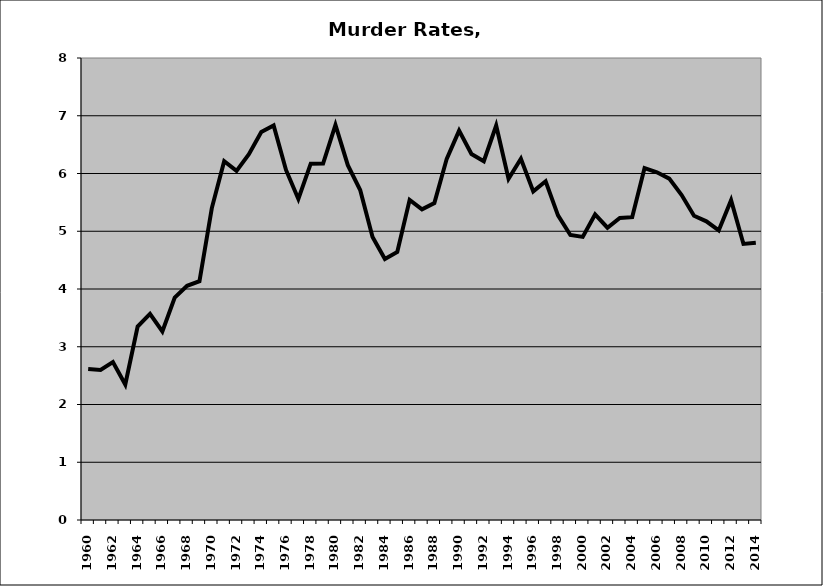
| Category | Murder |
|---|---|
| 1960.0 | 2.615 |
| 1961.0 | 2.599 |
| 1962.0 | 2.734 |
| 1963.0 | 2.346 |
| 1964.0 | 3.351 |
| 1965.0 | 3.568 |
| 1966.0 | 3.264 |
| 1967.0 | 3.852 |
| 1968.0 | 4.056 |
| 1969.0 | 4.135 |
| 1970.0 | 5.401 |
| 1971.0 | 6.213 |
| 1972.0 | 6.046 |
| 1973.0 | 6.335 |
| 1974.0 | 6.717 |
| 1975.0 | 6.832 |
| 1976.0 | 6.061 |
| 1977.0 | 5.558 |
| 1978.0 | 6.17 |
| 1979.0 | 6.172 |
| 1980.0 | 6.842 |
| 1981.0 | 6.145 |
| 1982.0 | 5.714 |
| 1983.0 | 4.901 |
| 1984.0 | 4.521 |
| 1985.0 | 4.64 |
| 1986.0 | 5.543 |
| 1987.0 | 5.379 |
| 1988.0 | 5.488 |
| 1989.0 | 6.254 |
| 1990.0 | 6.741 |
| 1991.0 | 6.337 |
| 1992.0 | 6.212 |
| 1993.0 | 6.831 |
| 1994.0 | 5.908 |
| 1995.0 | 6.254 |
| 1996.0 | 5.69 |
| 1997.0 | 5.865 |
| 1998.0 | 5.275 |
| 1999.0 | 4.936 |
| 2000.0 | 4.902 |
| 2001.0 | 5.291 |
| 2002.0 | 5.061 |
| 2003.0 | 5.23 |
| 2004.0 | 5.244 |
| 2005.0 | 6.094 |
| 2006.0 | 6.021 |
| 2007.0 | 5.912 |
| 2008.0 | 5.626 |
| 2009.0 | 5.268 |
| 2010.0 | 5.172 |
| 2011.0 | 5.014 |
| 2012.0 | 5.539 |
| 2013.0 | 4.78 |
| 2014.0 | 4.802 |